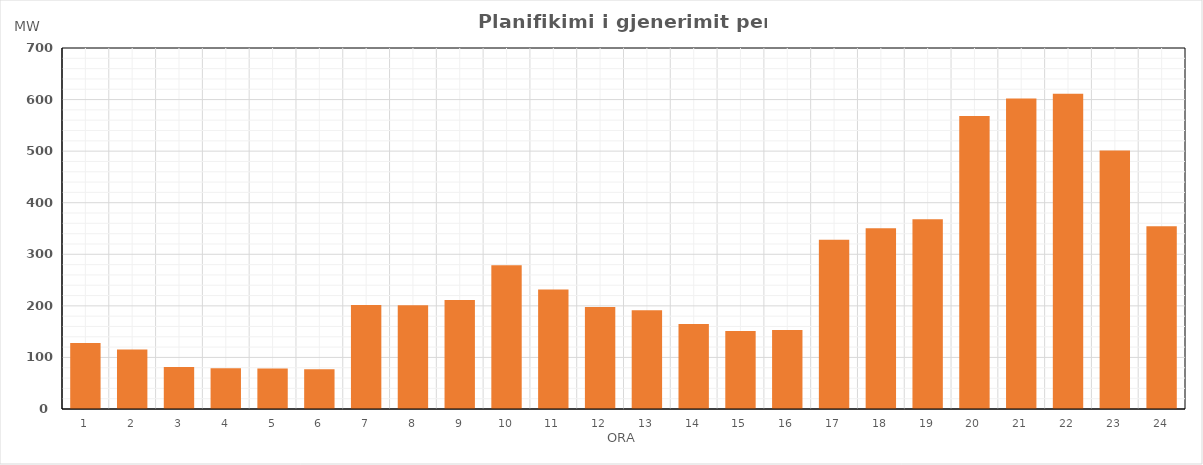
| Category | Max (MW) |
|---|---|
| 0 | 127.889 |
| 1 | 115.288 |
| 2 | 81.204 |
| 3 | 79.246 |
| 4 | 78.547 |
| 5 | 77.209 |
| 6 | 201.693 |
| 7 | 201.122 |
| 8 | 211.301 |
| 9 | 278.7 |
| 10 | 231.923 |
| 11 | 197.996 |
| 12 | 191.444 |
| 13 | 164.683 |
| 14 | 151.073 |
| 15 | 153.254 |
| 16 | 327.984 |
| 17 | 350.643 |
| 18 | 368.06 |
| 19 | 568.195 |
| 20 | 602.17 |
| 21 | 611.393 |
| 22 | 501.427 |
| 23 | 354.127 |